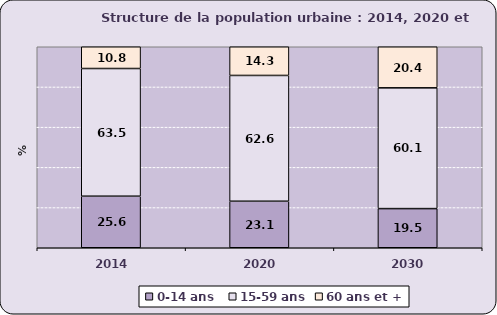
| Category | 0-14 ans  | 15-59 ans | 60 ans et + |
|---|---|---|---|
| 2014.0 | 25.649 | 63.524 | 10.827 |
| 2020.0 | 23.146 | 62.577 | 14.277 |
| 2030.0 | 19.476 | 60.081 | 20.442 |